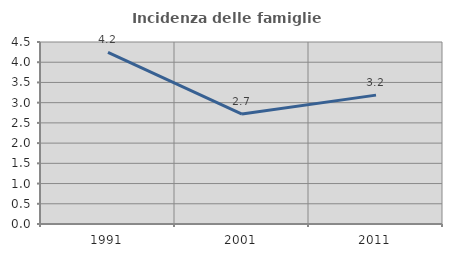
| Category | Incidenza delle famiglie numerose |
|---|---|
| 1991.0 | 4.242 |
| 2001.0 | 2.717 |
| 2011.0 | 3.186 |